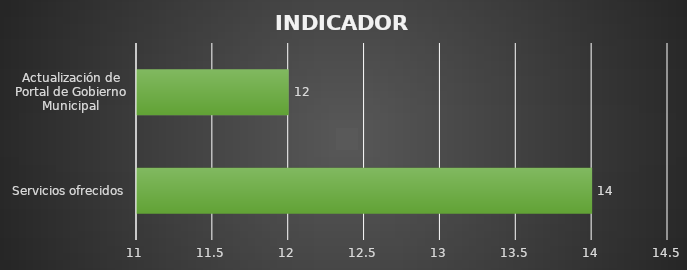
| Category | INDICADOR  |
|---|---|
| Servicios ofrecidos | 14 |
| Actualización de Portal de Gobierno Municipal | 12 |